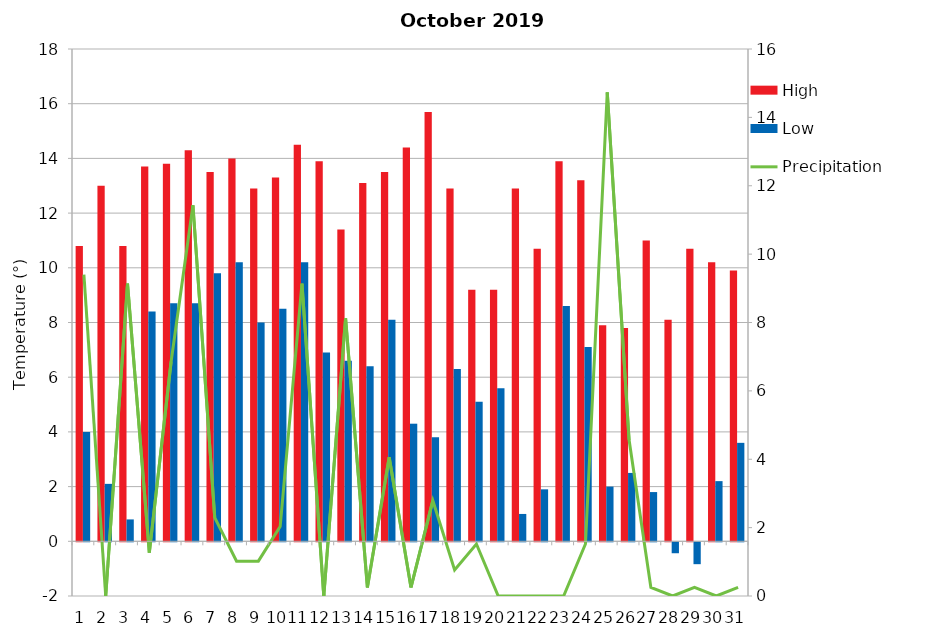
| Category | High | Low |
|---|---|---|
| 0 | 10.8 | 4 |
| 1 | 13 | 2.1 |
| 2 | 10.8 | 0.8 |
| 3 | 13.7 | 8.4 |
| 4 | 13.8 | 8.7 |
| 5 | 14.3 | 8.7 |
| 6 | 13.5 | 9.8 |
| 7 | 14 | 10.2 |
| 8 | 12.9 | 8 |
| 9 | 13.3 | 8.5 |
| 10 | 14.5 | 10.2 |
| 11 | 13.9 | 6.9 |
| 12 | 11.4 | 6.6 |
| 13 | 13.1 | 6.4 |
| 14 | 13.5 | 8.1 |
| 15 | 14.4 | 4.3 |
| 16 | 15.7 | 3.8 |
| 17 | 12.9 | 6.3 |
| 18 | 9.2 | 5.1 |
| 19 | 9.2 | 5.6 |
| 20 | 12.9 | 1 |
| 21 | 10.7 | 1.9 |
| 22 | 13.9 | 8.6 |
| 23 | 13.2 | 7.1 |
| 24 | 7.9 | 2 |
| 25 | 7.8 | 2.5 |
| 26 | 11 | 1.8 |
| 27 | 8.1 | -0.4 |
| 28 | 10.7 | -0.8 |
| 29 | 10.2 | 2.2 |
| 30 | 9.9 | 3.6 |